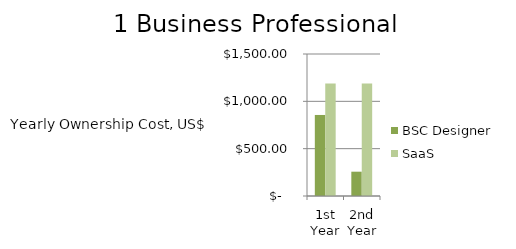
| Category | BSC Designer  | SaaS |
|---|---|---|
| 1st Year | 856 | 1188 |
| 2nd Year | 256.8 | 1188 |